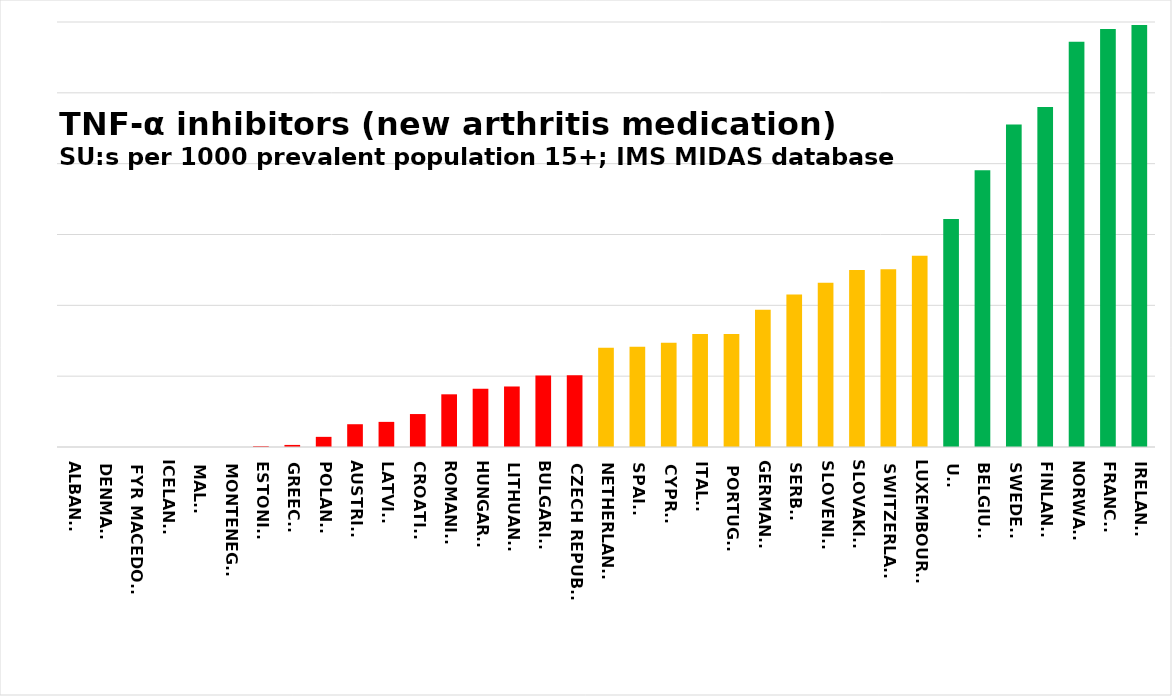
| Category | SU:s per 1000 prevalent population 15+ |
|---|---|
| ALBANIA | 0 |
| DENMARK | 0 |
| FYR MACEDONIA | 0 |
| ICELAND | 0 |
| MALTA | 0 |
| MONTENEGRO | 0 |
| ESTONIA  | 1.217 |
| GREECE  | 2.931 |
| POLAND  | 14.325 |
| AUSTRIA  | 32.15 |
| LATVIA  | 35.476 |
| CROATIA  | 46.519 |
| ROMANIA  | 74.381 |
| HUNGARY  | 82.122 |
| LITHUANIA  | 85.439 |
| BULGARIA  | 100.926 |
| CZECH REPUBLIC | 101.414 |
| NETHERLANDS | 140.235 |
| SPAIN  | 141.565 |
| CYPRUS | 147.29 |
| ITALY  | 159.395 |
| PORTUGAL  | 159.602 |
| GERMANY  | 193.912 |
| SERBIA | 215.13 |
| SLOVENIA  | 231.98 |
| SLOVAKIA  | 250 |
| SWITZERLAND | 251.018 |
| LUXEMBOURG  | 269.883 |
| UK  | 321.878 |
| BELGIUM  | 390.807 |
| SWEDEN  | 455.378 |
| FINLAND  | 480.11 |
| NORWAY  | 572.232 |
| FRANCE  | 589.954 |
| IRELAND  | 595.616 |